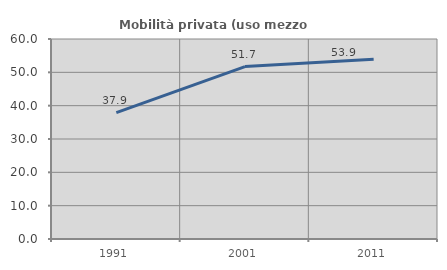
| Category | Mobilità privata (uso mezzo privato) |
|---|---|
| 1991.0 | 37.924 |
| 2001.0 | 51.731 |
| 2011.0 | 53.926 |